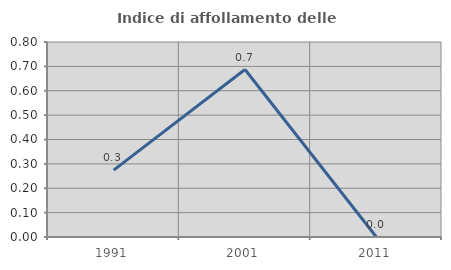
| Category | Indice di affollamento delle abitazioni  |
|---|---|
| 1991.0 | 0.274 |
| 2001.0 | 0.687 |
| 2011.0 | 0 |